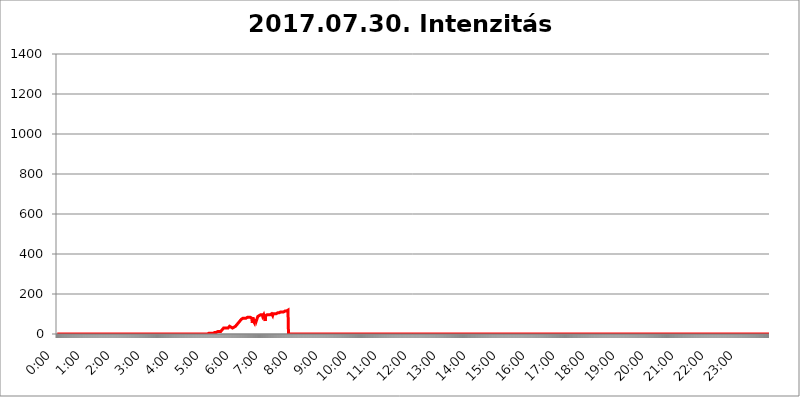
| Category | 2017.07.30. Intenzitás [W/m^2] |
|---|---|
| 0.0 | 0 |
| 0.0006944444444444445 | 0 |
| 0.001388888888888889 | 0 |
| 0.0020833333333333333 | 0 |
| 0.002777777777777778 | 0 |
| 0.003472222222222222 | 0 |
| 0.004166666666666667 | 0 |
| 0.004861111111111111 | 0 |
| 0.005555555555555556 | 0 |
| 0.0062499999999999995 | 0 |
| 0.006944444444444444 | 0 |
| 0.007638888888888889 | 0 |
| 0.008333333333333333 | 0 |
| 0.009027777777777779 | 0 |
| 0.009722222222222222 | 0 |
| 0.010416666666666666 | 0 |
| 0.011111111111111112 | 0 |
| 0.011805555555555555 | 0 |
| 0.012499999999999999 | 0 |
| 0.013194444444444444 | 0 |
| 0.013888888888888888 | 0 |
| 0.014583333333333332 | 0 |
| 0.015277777777777777 | 0 |
| 0.015972222222222224 | 0 |
| 0.016666666666666666 | 0 |
| 0.017361111111111112 | 0 |
| 0.018055555555555557 | 0 |
| 0.01875 | 0 |
| 0.019444444444444445 | 0 |
| 0.02013888888888889 | 0 |
| 0.020833333333333332 | 0 |
| 0.02152777777777778 | 0 |
| 0.022222222222222223 | 0 |
| 0.02291666666666667 | 0 |
| 0.02361111111111111 | 0 |
| 0.024305555555555556 | 0 |
| 0.024999999999999998 | 0 |
| 0.025694444444444447 | 0 |
| 0.02638888888888889 | 0 |
| 0.027083333333333334 | 0 |
| 0.027777777777777776 | 0 |
| 0.02847222222222222 | 0 |
| 0.029166666666666664 | 0 |
| 0.029861111111111113 | 0 |
| 0.030555555555555555 | 0 |
| 0.03125 | 0 |
| 0.03194444444444445 | 0 |
| 0.03263888888888889 | 0 |
| 0.03333333333333333 | 0 |
| 0.034027777777777775 | 0 |
| 0.034722222222222224 | 0 |
| 0.035416666666666666 | 0 |
| 0.036111111111111115 | 0 |
| 0.03680555555555556 | 0 |
| 0.0375 | 0 |
| 0.03819444444444444 | 0 |
| 0.03888888888888889 | 0 |
| 0.03958333333333333 | 0 |
| 0.04027777777777778 | 0 |
| 0.04097222222222222 | 0 |
| 0.041666666666666664 | 0 |
| 0.042361111111111106 | 0 |
| 0.04305555555555556 | 0 |
| 0.043750000000000004 | 0 |
| 0.044444444444444446 | 0 |
| 0.04513888888888889 | 0 |
| 0.04583333333333334 | 0 |
| 0.04652777777777778 | 0 |
| 0.04722222222222222 | 0 |
| 0.04791666666666666 | 0 |
| 0.04861111111111111 | 0 |
| 0.049305555555555554 | 0 |
| 0.049999999999999996 | 0 |
| 0.05069444444444445 | 0 |
| 0.051388888888888894 | 0 |
| 0.052083333333333336 | 0 |
| 0.05277777777777778 | 0 |
| 0.05347222222222222 | 0 |
| 0.05416666666666667 | 0 |
| 0.05486111111111111 | 0 |
| 0.05555555555555555 | 0 |
| 0.05625 | 0 |
| 0.05694444444444444 | 0 |
| 0.057638888888888885 | 0 |
| 0.05833333333333333 | 0 |
| 0.05902777777777778 | 0 |
| 0.059722222222222225 | 0 |
| 0.06041666666666667 | 0 |
| 0.061111111111111116 | 0 |
| 0.06180555555555556 | 0 |
| 0.0625 | 0 |
| 0.06319444444444444 | 0 |
| 0.06388888888888888 | 0 |
| 0.06458333333333334 | 0 |
| 0.06527777777777778 | 0 |
| 0.06597222222222222 | 0 |
| 0.06666666666666667 | 0 |
| 0.06736111111111111 | 0 |
| 0.06805555555555555 | 0 |
| 0.06874999999999999 | 0 |
| 0.06944444444444443 | 0 |
| 0.07013888888888889 | 0 |
| 0.07083333333333333 | 0 |
| 0.07152777777777779 | 0 |
| 0.07222222222222223 | 0 |
| 0.07291666666666667 | 0 |
| 0.07361111111111111 | 0 |
| 0.07430555555555556 | 0 |
| 0.075 | 0 |
| 0.07569444444444444 | 0 |
| 0.0763888888888889 | 0 |
| 0.07708333333333334 | 0 |
| 0.07777777777777778 | 0 |
| 0.07847222222222222 | 0 |
| 0.07916666666666666 | 0 |
| 0.0798611111111111 | 0 |
| 0.08055555555555556 | 0 |
| 0.08125 | 0 |
| 0.08194444444444444 | 0 |
| 0.08263888888888889 | 0 |
| 0.08333333333333333 | 0 |
| 0.08402777777777777 | 0 |
| 0.08472222222222221 | 0 |
| 0.08541666666666665 | 0 |
| 0.08611111111111112 | 0 |
| 0.08680555555555557 | 0 |
| 0.08750000000000001 | 0 |
| 0.08819444444444445 | 0 |
| 0.08888888888888889 | 0 |
| 0.08958333333333333 | 0 |
| 0.09027777777777778 | 0 |
| 0.09097222222222222 | 0 |
| 0.09166666666666667 | 0 |
| 0.09236111111111112 | 0 |
| 0.09305555555555556 | 0 |
| 0.09375 | 0 |
| 0.09444444444444444 | 0 |
| 0.09513888888888888 | 0 |
| 0.09583333333333333 | 0 |
| 0.09652777777777777 | 0 |
| 0.09722222222222222 | 0 |
| 0.09791666666666667 | 0 |
| 0.09861111111111111 | 0 |
| 0.09930555555555555 | 0 |
| 0.09999999999999999 | 0 |
| 0.10069444444444443 | 0 |
| 0.1013888888888889 | 0 |
| 0.10208333333333335 | 0 |
| 0.10277777777777779 | 0 |
| 0.10347222222222223 | 0 |
| 0.10416666666666667 | 0 |
| 0.10486111111111111 | 0 |
| 0.10555555555555556 | 0 |
| 0.10625 | 0 |
| 0.10694444444444444 | 0 |
| 0.1076388888888889 | 0 |
| 0.10833333333333334 | 0 |
| 0.10902777777777778 | 0 |
| 0.10972222222222222 | 0 |
| 0.1111111111111111 | 0 |
| 0.11180555555555556 | 0 |
| 0.11180555555555556 | 0 |
| 0.1125 | 0 |
| 0.11319444444444444 | 0 |
| 0.11388888888888889 | 0 |
| 0.11458333333333333 | 0 |
| 0.11527777777777777 | 0 |
| 0.11597222222222221 | 0 |
| 0.11666666666666665 | 0 |
| 0.1173611111111111 | 0 |
| 0.11805555555555557 | 0 |
| 0.11944444444444445 | 0 |
| 0.12013888888888889 | 0 |
| 0.12083333333333333 | 0 |
| 0.12152777777777778 | 0 |
| 0.12222222222222223 | 0 |
| 0.12291666666666667 | 0 |
| 0.12291666666666667 | 0 |
| 0.12361111111111112 | 0 |
| 0.12430555555555556 | 0 |
| 0.125 | 0 |
| 0.12569444444444444 | 0 |
| 0.12638888888888888 | 0 |
| 0.12708333333333333 | 0 |
| 0.16875 | 0 |
| 0.12847222222222224 | 0 |
| 0.12916666666666668 | 0 |
| 0.12986111111111112 | 0 |
| 0.13055555555555556 | 0 |
| 0.13125 | 0 |
| 0.13194444444444445 | 0 |
| 0.1326388888888889 | 0 |
| 0.13333333333333333 | 0 |
| 0.13402777777777777 | 0 |
| 0.13402777777777777 | 0 |
| 0.13472222222222222 | 0 |
| 0.13541666666666666 | 0 |
| 0.1361111111111111 | 0 |
| 0.13749999999999998 | 0 |
| 0.13819444444444443 | 0 |
| 0.1388888888888889 | 0 |
| 0.13958333333333334 | 0 |
| 0.14027777777777778 | 0 |
| 0.14097222222222222 | 0 |
| 0.14166666666666666 | 0 |
| 0.1423611111111111 | 0 |
| 0.14305555555555557 | 0 |
| 0.14375000000000002 | 0 |
| 0.14444444444444446 | 0 |
| 0.1451388888888889 | 0 |
| 0.1451388888888889 | 0 |
| 0.14652777777777778 | 0 |
| 0.14722222222222223 | 0 |
| 0.14791666666666667 | 0 |
| 0.1486111111111111 | 0 |
| 0.14930555555555555 | 0 |
| 0.15 | 0 |
| 0.15069444444444444 | 0 |
| 0.15138888888888888 | 0 |
| 0.15208333333333332 | 0 |
| 0.15277777777777776 | 0 |
| 0.15347222222222223 | 0 |
| 0.15416666666666667 | 0 |
| 0.15486111111111112 | 0 |
| 0.15555555555555556 | 0 |
| 0.15625 | 0 |
| 0.15694444444444444 | 0 |
| 0.15763888888888888 | 0 |
| 0.15833333333333333 | 0 |
| 0.15902777777777777 | 0 |
| 0.15972222222222224 | 0 |
| 0.16041666666666668 | 0 |
| 0.16111111111111112 | 0 |
| 0.16180555555555556 | 0 |
| 0.1625 | 0 |
| 0.16319444444444445 | 0 |
| 0.1638888888888889 | 0 |
| 0.16458333333333333 | 0 |
| 0.16527777777777777 | 0 |
| 0.16597222222222222 | 0 |
| 0.16666666666666666 | 0 |
| 0.1673611111111111 | 0 |
| 0.16805555555555554 | 0 |
| 0.16874999999999998 | 0 |
| 0.16944444444444443 | 0 |
| 0.17013888888888887 | 0 |
| 0.1708333333333333 | 0 |
| 0.17152777777777775 | 0 |
| 0.17222222222222225 | 0 |
| 0.1729166666666667 | 0 |
| 0.17361111111111113 | 0 |
| 0.17430555555555557 | 0 |
| 0.17500000000000002 | 0 |
| 0.17569444444444446 | 0 |
| 0.1763888888888889 | 0 |
| 0.17708333333333334 | 0 |
| 0.17777777777777778 | 0 |
| 0.17847222222222223 | 0 |
| 0.17916666666666667 | 0 |
| 0.1798611111111111 | 0 |
| 0.18055555555555555 | 0 |
| 0.18125 | 0 |
| 0.18194444444444444 | 0 |
| 0.1826388888888889 | 0 |
| 0.18333333333333335 | 0 |
| 0.1840277777777778 | 0 |
| 0.18472222222222223 | 0 |
| 0.18541666666666667 | 0 |
| 0.18611111111111112 | 0 |
| 0.18680555555555556 | 0 |
| 0.1875 | 0 |
| 0.18819444444444444 | 0 |
| 0.18888888888888888 | 0 |
| 0.18958333333333333 | 0 |
| 0.19027777777777777 | 0 |
| 0.1909722222222222 | 0 |
| 0.19166666666666665 | 0 |
| 0.19236111111111112 | 0 |
| 0.19305555555555554 | 0 |
| 0.19375 | 0 |
| 0.19444444444444445 | 0 |
| 0.1951388888888889 | 0 |
| 0.19583333333333333 | 0 |
| 0.19652777777777777 | 0 |
| 0.19722222222222222 | 0 |
| 0.19791666666666666 | 0 |
| 0.1986111111111111 | 0 |
| 0.19930555555555554 | 0 |
| 0.19999999999999998 | 0 |
| 0.20069444444444443 | 0 |
| 0.20138888888888887 | 0 |
| 0.2020833333333333 | 0 |
| 0.2027777777777778 | 0 |
| 0.2034722222222222 | 0 |
| 0.2041666666666667 | 0 |
| 0.20486111111111113 | 0 |
| 0.20555555555555557 | 0 |
| 0.20625000000000002 | 0 |
| 0.20694444444444446 | 0 |
| 0.2076388888888889 | 0 |
| 0.20833333333333334 | 0 |
| 0.20902777777777778 | 0 |
| 0.20972222222222223 | 0 |
| 0.21041666666666667 | 0 |
| 0.2111111111111111 | 0 |
| 0.21180555555555555 | 0 |
| 0.2125 | 3.525 |
| 0.21319444444444444 | 3.525 |
| 0.2138888888888889 | 3.525 |
| 0.21458333333333335 | 3.525 |
| 0.2152777777777778 | 3.525 |
| 0.21597222222222223 | 3.525 |
| 0.21666666666666667 | 3.525 |
| 0.21736111111111112 | 3.525 |
| 0.21805555555555556 | 3.525 |
| 0.21875 | 3.525 |
| 0.21944444444444444 | 7.887 |
| 0.22013888888888888 | 7.887 |
| 0.22083333333333333 | 7.887 |
| 0.22152777777777777 | 7.887 |
| 0.2222222222222222 | 7.887 |
| 0.22291666666666665 | 7.887 |
| 0.2236111111111111 | 7.887 |
| 0.22430555555555556 | 7.887 |
| 0.225 | 12.257 |
| 0.22569444444444445 | 12.257 |
| 0.2263888888888889 | 12.257 |
| 0.22708333333333333 | 12.257 |
| 0.22777777777777777 | 12.257 |
| 0.22847222222222222 | 12.257 |
| 0.22916666666666666 | 12.257 |
| 0.2298611111111111 | 12.257 |
| 0.23055555555555554 | 16.636 |
| 0.23124999999999998 | 21.024 |
| 0.23194444444444443 | 21.024 |
| 0.23263888888888887 | 25.419 |
| 0.2333333333333333 | 29.823 |
| 0.2340277777777778 | 29.823 |
| 0.2347222222222222 | 29.823 |
| 0.2354166666666667 | 29.823 |
| 0.23611111111111113 | 29.823 |
| 0.23680555555555557 | 29.823 |
| 0.23750000000000002 | 29.823 |
| 0.23819444444444446 | 29.823 |
| 0.2388888888888889 | 29.823 |
| 0.23958333333333334 | 29.823 |
| 0.24027777777777778 | 34.234 |
| 0.24097222222222223 | 34.234 |
| 0.24166666666666667 | 38.653 |
| 0.2423611111111111 | 38.653 |
| 0.24305555555555555 | 38.653 |
| 0.24375 | 34.234 |
| 0.24444444444444446 | 29.823 |
| 0.24513888888888888 | 29.823 |
| 0.24583333333333335 | 29.823 |
| 0.2465277777777778 | 29.823 |
| 0.24722222222222223 | 29.823 |
| 0.24791666666666667 | 34.234 |
| 0.24861111111111112 | 38.653 |
| 0.24930555555555556 | 34.234 |
| 0.25 | 38.653 |
| 0.25069444444444444 | 38.653 |
| 0.2513888888888889 | 43.079 |
| 0.2520833333333333 | 47.511 |
| 0.25277777777777777 | 47.511 |
| 0.2534722222222222 | 51.951 |
| 0.25416666666666665 | 56.398 |
| 0.2548611111111111 | 51.951 |
| 0.2555555555555556 | 60.85 |
| 0.25625000000000003 | 65.31 |
| 0.2569444444444445 | 60.85 |
| 0.2576388888888889 | 65.31 |
| 0.25833333333333336 | 74.246 |
| 0.2590277777777778 | 69.775 |
| 0.25972222222222224 | 78.722 |
| 0.2604166666666667 | 78.722 |
| 0.2611111111111111 | 78.722 |
| 0.26180555555555557 | 78.722 |
| 0.2625 | 78.722 |
| 0.26319444444444445 | 78.722 |
| 0.2638888888888889 | 78.722 |
| 0.26458333333333334 | 78.722 |
| 0.2652777777777778 | 78.722 |
| 0.2659722222222222 | 83.205 |
| 0.26666666666666666 | 83.205 |
| 0.2673611111111111 | 83.205 |
| 0.26805555555555555 | 83.205 |
| 0.26875 | 83.205 |
| 0.26944444444444443 | 83.205 |
| 0.2701388888888889 | 83.205 |
| 0.2708333333333333 | 83.205 |
| 0.27152777777777776 | 83.205 |
| 0.2722222222222222 | 78.722 |
| 0.27291666666666664 | 78.722 |
| 0.2736111111111111 | 56.398 |
| 0.2743055555555555 | 83.205 |
| 0.27499999999999997 | 65.31 |
| 0.27569444444444446 | 60.85 |
| 0.27638888888888885 | 56.398 |
| 0.27708333333333335 | 74.246 |
| 0.2777777777777778 | 56.398 |
| 0.27847222222222223 | 74.246 |
| 0.2791666666666667 | 65.31 |
| 0.2798611111111111 | 65.31 |
| 0.28055555555555556 | 65.31 |
| 0.28125 | 87.692 |
| 0.28194444444444444 | 87.692 |
| 0.2826388888888889 | 92.184 |
| 0.2833333333333333 | 92.184 |
| 0.28402777777777777 | 87.692 |
| 0.2847222222222222 | 92.184 |
| 0.28541666666666665 | 96.682 |
| 0.28611111111111115 | 96.682 |
| 0.28680555555555554 | 96.682 |
| 0.28750000000000003 | 96.682 |
| 0.2881944444444445 | 87.692 |
| 0.2888888888888889 | 92.184 |
| 0.28958333333333336 | 96.682 |
| 0.2902777777777778 | 96.682 |
| 0.29097222222222224 | 78.722 |
| 0.2916666666666667 | 65.31 |
| 0.2923611111111111 | 92.184 |
| 0.29305555555555557 | 87.692 |
| 0.29375 | 96.682 |
| 0.29444444444444445 | 96.682 |
| 0.2951388888888889 | 96.682 |
| 0.29583333333333334 | 96.682 |
| 0.2965277777777778 | 96.682 |
| 0.2972222222222222 | 96.682 |
| 0.29791666666666666 | 96.682 |
| 0.2986111111111111 | 96.682 |
| 0.29930555555555555 | 96.682 |
| 0.3 | 96.682 |
| 0.30069444444444443 | 101.184 |
| 0.3013888888888889 | 101.184 |
| 0.3020833333333333 | 92.184 |
| 0.30277777777777776 | 101.184 |
| 0.3034722222222222 | 101.184 |
| 0.30416666666666664 | 101.184 |
| 0.3048611111111111 | 101.184 |
| 0.3055555555555555 | 101.184 |
| 0.30624999999999997 | 101.184 |
| 0.3069444444444444 | 101.184 |
| 0.3076388888888889 | 101.184 |
| 0.30833333333333335 | 105.69 |
| 0.3090277777777778 | 105.69 |
| 0.30972222222222223 | 105.69 |
| 0.3104166666666667 | 105.69 |
| 0.3111111111111111 | 105.69 |
| 0.31180555555555556 | 110.201 |
| 0.3125 | 110.201 |
| 0.31319444444444444 | 110.201 |
| 0.3138888888888889 | 110.201 |
| 0.3145833333333333 | 110.201 |
| 0.31527777777777777 | 110.201 |
| 0.3159722222222222 | 110.201 |
| 0.31666666666666665 | 110.201 |
| 0.31736111111111115 | 110.201 |
| 0.31805555555555554 | 110.201 |
| 0.31875000000000003 | 114.716 |
| 0.3194444444444445 | 114.716 |
| 0.3201388888888889 | 114.716 |
| 0.32083333333333336 | 114.716 |
| 0.3215277777777778 | 114.716 |
| 0.32222222222222224 | 119.235 |
| 0.3229166666666667 | 119.235 |
| 0.3236111111111111 | 119.235 |
| 0.32430555555555557 | 0 |
| 0.325 | 0 |
| 0.32569444444444445 | 0 |
| 0.3263888888888889 | 0 |
| 0.32708333333333334 | 0 |
| 0.3277777777777778 | 0 |
| 0.3284722222222222 | 0 |
| 0.32916666666666666 | 0 |
| 0.3298611111111111 | 0 |
| 0.33055555555555555 | 0 |
| 0.33125 | 0 |
| 0.33194444444444443 | 0 |
| 0.3326388888888889 | 0 |
| 0.3333333333333333 | 0 |
| 0.3340277777777778 | 0 |
| 0.3347222222222222 | 0 |
| 0.3354166666666667 | 0 |
| 0.3361111111111111 | 0 |
| 0.3368055555555556 | 0 |
| 0.33749999999999997 | 0 |
| 0.33819444444444446 | 0 |
| 0.33888888888888885 | 0 |
| 0.33958333333333335 | 0 |
| 0.34027777777777773 | 0 |
| 0.34097222222222223 | 0 |
| 0.3416666666666666 | 0 |
| 0.3423611111111111 | 0 |
| 0.3430555555555555 | 0 |
| 0.34375 | 0 |
| 0.3444444444444445 | 0 |
| 0.3451388888888889 | 0 |
| 0.3458333333333334 | 0 |
| 0.34652777777777777 | 0 |
| 0.34722222222222227 | 0 |
| 0.34791666666666665 | 0 |
| 0.34861111111111115 | 0 |
| 0.34930555555555554 | 0 |
| 0.35000000000000003 | 0 |
| 0.3506944444444444 | 0 |
| 0.3513888888888889 | 0 |
| 0.3520833333333333 | 0 |
| 0.3527777777777778 | 0 |
| 0.3534722222222222 | 0 |
| 0.3541666666666667 | 0 |
| 0.3548611111111111 | 0 |
| 0.35555555555555557 | 0 |
| 0.35625 | 0 |
| 0.35694444444444445 | 0 |
| 0.3576388888888889 | 0 |
| 0.35833333333333334 | 0 |
| 0.3590277777777778 | 0 |
| 0.3597222222222222 | 0 |
| 0.36041666666666666 | 0 |
| 0.3611111111111111 | 0 |
| 0.36180555555555555 | 0 |
| 0.3625 | 0 |
| 0.36319444444444443 | 0 |
| 0.3638888888888889 | 0 |
| 0.3645833333333333 | 0 |
| 0.3652777777777778 | 0 |
| 0.3659722222222222 | 0 |
| 0.3666666666666667 | 0 |
| 0.3673611111111111 | 0 |
| 0.3680555555555556 | 0 |
| 0.36874999999999997 | 0 |
| 0.36944444444444446 | 0 |
| 0.37013888888888885 | 0 |
| 0.37083333333333335 | 0 |
| 0.37152777777777773 | 0 |
| 0.37222222222222223 | 0 |
| 0.3729166666666666 | 0 |
| 0.3736111111111111 | 0 |
| 0.3743055555555555 | 0 |
| 0.375 | 0 |
| 0.3756944444444445 | 0 |
| 0.3763888888888889 | 0 |
| 0.3770833333333334 | 0 |
| 0.37777777777777777 | 0 |
| 0.37847222222222227 | 0 |
| 0.37916666666666665 | 0 |
| 0.37986111111111115 | 0 |
| 0.38055555555555554 | 0 |
| 0.38125000000000003 | 0 |
| 0.3819444444444444 | 0 |
| 0.3826388888888889 | 0 |
| 0.3833333333333333 | 0 |
| 0.3840277777777778 | 0 |
| 0.3847222222222222 | 0 |
| 0.3854166666666667 | 0 |
| 0.3861111111111111 | 0 |
| 0.38680555555555557 | 0 |
| 0.3875 | 0 |
| 0.38819444444444445 | 0 |
| 0.3888888888888889 | 0 |
| 0.38958333333333334 | 0 |
| 0.3902777777777778 | 0 |
| 0.3909722222222222 | 0 |
| 0.39166666666666666 | 0 |
| 0.3923611111111111 | 0 |
| 0.39305555555555555 | 0 |
| 0.39375 | 0 |
| 0.39444444444444443 | 0 |
| 0.3951388888888889 | 0 |
| 0.3958333333333333 | 0 |
| 0.3965277777777778 | 0 |
| 0.3972222222222222 | 0 |
| 0.3979166666666667 | 0 |
| 0.3986111111111111 | 0 |
| 0.3993055555555556 | 0 |
| 0.39999999999999997 | 0 |
| 0.40069444444444446 | 0 |
| 0.40138888888888885 | 0 |
| 0.40208333333333335 | 0 |
| 0.40277777777777773 | 0 |
| 0.40347222222222223 | 0 |
| 0.4041666666666666 | 0 |
| 0.4048611111111111 | 0 |
| 0.4055555555555555 | 0 |
| 0.40625 | 0 |
| 0.4069444444444445 | 0 |
| 0.4076388888888889 | 0 |
| 0.4083333333333334 | 0 |
| 0.40902777777777777 | 0 |
| 0.40972222222222227 | 0 |
| 0.41041666666666665 | 0 |
| 0.41111111111111115 | 0 |
| 0.41180555555555554 | 0 |
| 0.41250000000000003 | 0 |
| 0.4131944444444444 | 0 |
| 0.4138888888888889 | 0 |
| 0.4145833333333333 | 0 |
| 0.4152777777777778 | 0 |
| 0.4159722222222222 | 0 |
| 0.4166666666666667 | 0 |
| 0.4173611111111111 | 0 |
| 0.41805555555555557 | 0 |
| 0.41875 | 0 |
| 0.41944444444444445 | 0 |
| 0.4201388888888889 | 0 |
| 0.42083333333333334 | 0 |
| 0.4215277777777778 | 0 |
| 0.4222222222222222 | 0 |
| 0.42291666666666666 | 0 |
| 0.4236111111111111 | 0 |
| 0.42430555555555555 | 0 |
| 0.425 | 0 |
| 0.42569444444444443 | 0 |
| 0.4263888888888889 | 0 |
| 0.4270833333333333 | 0 |
| 0.4277777777777778 | 0 |
| 0.4284722222222222 | 0 |
| 0.4291666666666667 | 0 |
| 0.4298611111111111 | 0 |
| 0.4305555555555556 | 0 |
| 0.43124999999999997 | 0 |
| 0.43194444444444446 | 0 |
| 0.43263888888888885 | 0 |
| 0.43333333333333335 | 0 |
| 0.43402777777777773 | 0 |
| 0.43472222222222223 | 0 |
| 0.4354166666666666 | 0 |
| 0.4361111111111111 | 0 |
| 0.4368055555555555 | 0 |
| 0.4375 | 0 |
| 0.4381944444444445 | 0 |
| 0.4388888888888889 | 0 |
| 0.4395833333333334 | 0 |
| 0.44027777777777777 | 0 |
| 0.44097222222222227 | 0 |
| 0.44166666666666665 | 0 |
| 0.44236111111111115 | 0 |
| 0.44305555555555554 | 0 |
| 0.44375000000000003 | 0 |
| 0.4444444444444444 | 0 |
| 0.4451388888888889 | 0 |
| 0.4458333333333333 | 0 |
| 0.4465277777777778 | 0 |
| 0.4472222222222222 | 0 |
| 0.4479166666666667 | 0 |
| 0.4486111111111111 | 0 |
| 0.44930555555555557 | 0 |
| 0.45 | 0 |
| 0.45069444444444445 | 0 |
| 0.4513888888888889 | 0 |
| 0.45208333333333334 | 0 |
| 0.4527777777777778 | 0 |
| 0.4534722222222222 | 0 |
| 0.45416666666666666 | 0 |
| 0.4548611111111111 | 0 |
| 0.45555555555555555 | 0 |
| 0.45625 | 0 |
| 0.45694444444444443 | 0 |
| 0.4576388888888889 | 0 |
| 0.4583333333333333 | 0 |
| 0.4590277777777778 | 0 |
| 0.4597222222222222 | 0 |
| 0.4604166666666667 | 0 |
| 0.4611111111111111 | 0 |
| 0.4618055555555556 | 0 |
| 0.46249999999999997 | 0 |
| 0.46319444444444446 | 0 |
| 0.46388888888888885 | 0 |
| 0.46458333333333335 | 0 |
| 0.46527777777777773 | 0 |
| 0.46597222222222223 | 0 |
| 0.4666666666666666 | 0 |
| 0.4673611111111111 | 0 |
| 0.4680555555555555 | 0 |
| 0.46875 | 0 |
| 0.4694444444444445 | 0 |
| 0.4701388888888889 | 0 |
| 0.4708333333333334 | 0 |
| 0.47152777777777777 | 0 |
| 0.47222222222222227 | 0 |
| 0.47291666666666665 | 0 |
| 0.47361111111111115 | 0 |
| 0.47430555555555554 | 0 |
| 0.47500000000000003 | 0 |
| 0.4756944444444444 | 0 |
| 0.4763888888888889 | 0 |
| 0.4770833333333333 | 0 |
| 0.4777777777777778 | 0 |
| 0.4784722222222222 | 0 |
| 0.4791666666666667 | 0 |
| 0.4798611111111111 | 0 |
| 0.48055555555555557 | 0 |
| 0.48125 | 0 |
| 0.48194444444444445 | 0 |
| 0.4826388888888889 | 0 |
| 0.48333333333333334 | 0 |
| 0.4840277777777778 | 0 |
| 0.4847222222222222 | 0 |
| 0.48541666666666666 | 0 |
| 0.4861111111111111 | 0 |
| 0.48680555555555555 | 0 |
| 0.4875 | 0 |
| 0.48819444444444443 | 0 |
| 0.4888888888888889 | 0 |
| 0.4895833333333333 | 0 |
| 0.4902777777777778 | 0 |
| 0.4909722222222222 | 0 |
| 0.4916666666666667 | 0 |
| 0.4923611111111111 | 0 |
| 0.4930555555555556 | 0 |
| 0.49374999999999997 | 0 |
| 0.49444444444444446 | 0 |
| 0.49513888888888885 | 0 |
| 0.49583333333333335 | 0 |
| 0.49652777777777773 | 0 |
| 0.49722222222222223 | 0 |
| 0.4979166666666666 | 0 |
| 0.4986111111111111 | 0 |
| 0.4993055555555555 | 0 |
| 0.5 | 0 |
| 0.5006944444444444 | 0 |
| 0.5013888888888889 | 0 |
| 0.5020833333333333 | 0 |
| 0.5027777777777778 | 0 |
| 0.5034722222222222 | 0 |
| 0.5041666666666667 | 0 |
| 0.5048611111111111 | 0 |
| 0.5055555555555555 | 0 |
| 0.50625 | 0 |
| 0.5069444444444444 | 0 |
| 0.5076388888888889 | 0 |
| 0.5083333333333333 | 0 |
| 0.5090277777777777 | 0 |
| 0.5097222222222222 | 0 |
| 0.5104166666666666 | 0 |
| 0.5111111111111112 | 0 |
| 0.5118055555555555 | 0 |
| 0.5125000000000001 | 0 |
| 0.5131944444444444 | 0 |
| 0.513888888888889 | 0 |
| 0.5145833333333333 | 0 |
| 0.5152777777777778 | 0 |
| 0.5159722222222222 | 0 |
| 0.5166666666666667 | 0 |
| 0.517361111111111 | 0 |
| 0.5180555555555556 | 0 |
| 0.5187499999999999 | 0 |
| 0.5194444444444445 | 0 |
| 0.5201388888888888 | 0 |
| 0.5208333333333334 | 0 |
| 0.5215277777777778 | 0 |
| 0.5222222222222223 | 0 |
| 0.5229166666666667 | 0 |
| 0.5236111111111111 | 0 |
| 0.5243055555555556 | 0 |
| 0.525 | 0 |
| 0.5256944444444445 | 0 |
| 0.5263888888888889 | 0 |
| 0.5270833333333333 | 0 |
| 0.5277777777777778 | 0 |
| 0.5284722222222222 | 0 |
| 0.5291666666666667 | 0 |
| 0.5298611111111111 | 0 |
| 0.5305555555555556 | 0 |
| 0.53125 | 0 |
| 0.5319444444444444 | 0 |
| 0.5326388888888889 | 0 |
| 0.5333333333333333 | 0 |
| 0.5340277777777778 | 0 |
| 0.5347222222222222 | 0 |
| 0.5354166666666667 | 0 |
| 0.5361111111111111 | 0 |
| 0.5368055555555555 | 0 |
| 0.5375 | 0 |
| 0.5381944444444444 | 0 |
| 0.5388888888888889 | 0 |
| 0.5395833333333333 | 0 |
| 0.5402777777777777 | 0 |
| 0.5409722222222222 | 0 |
| 0.5416666666666666 | 0 |
| 0.5423611111111112 | 0 |
| 0.5430555555555555 | 0 |
| 0.5437500000000001 | 0 |
| 0.5444444444444444 | 0 |
| 0.545138888888889 | 0 |
| 0.5458333333333333 | 0 |
| 0.5465277777777778 | 0 |
| 0.5472222222222222 | 0 |
| 0.5479166666666667 | 0 |
| 0.548611111111111 | 0 |
| 0.5493055555555556 | 0 |
| 0.5499999999999999 | 0 |
| 0.5506944444444445 | 0 |
| 0.5513888888888888 | 0 |
| 0.5520833333333334 | 0 |
| 0.5527777777777778 | 0 |
| 0.5534722222222223 | 0 |
| 0.5541666666666667 | 0 |
| 0.5548611111111111 | 0 |
| 0.5555555555555556 | 0 |
| 0.55625 | 0 |
| 0.5569444444444445 | 0 |
| 0.5576388888888889 | 0 |
| 0.5583333333333333 | 0 |
| 0.5590277777777778 | 0 |
| 0.5597222222222222 | 0 |
| 0.5604166666666667 | 0 |
| 0.5611111111111111 | 0 |
| 0.5618055555555556 | 0 |
| 0.5625 | 0 |
| 0.5631944444444444 | 0 |
| 0.5638888888888889 | 0 |
| 0.5645833333333333 | 0 |
| 0.5652777777777778 | 0 |
| 0.5659722222222222 | 0 |
| 0.5666666666666667 | 0 |
| 0.5673611111111111 | 0 |
| 0.5680555555555555 | 0 |
| 0.56875 | 0 |
| 0.5694444444444444 | 0 |
| 0.5701388888888889 | 0 |
| 0.5708333333333333 | 0 |
| 0.5715277777777777 | 0 |
| 0.5722222222222222 | 0 |
| 0.5729166666666666 | 0 |
| 0.5736111111111112 | 0 |
| 0.5743055555555555 | 0 |
| 0.5750000000000001 | 0 |
| 0.5756944444444444 | 0 |
| 0.576388888888889 | 0 |
| 0.5770833333333333 | 0 |
| 0.5777777777777778 | 0 |
| 0.5784722222222222 | 0 |
| 0.5791666666666667 | 0 |
| 0.579861111111111 | 0 |
| 0.5805555555555556 | 0 |
| 0.5812499999999999 | 0 |
| 0.5819444444444445 | 0 |
| 0.5826388888888888 | 0 |
| 0.5833333333333334 | 0 |
| 0.5840277777777778 | 0 |
| 0.5847222222222223 | 0 |
| 0.5854166666666667 | 0 |
| 0.5861111111111111 | 0 |
| 0.5868055555555556 | 0 |
| 0.5875 | 0 |
| 0.5881944444444445 | 0 |
| 0.5888888888888889 | 0 |
| 0.5895833333333333 | 0 |
| 0.5902777777777778 | 0 |
| 0.5909722222222222 | 0 |
| 0.5916666666666667 | 0 |
| 0.5923611111111111 | 0 |
| 0.5930555555555556 | 0 |
| 0.59375 | 0 |
| 0.5944444444444444 | 0 |
| 0.5951388888888889 | 0 |
| 0.5958333333333333 | 0 |
| 0.5965277777777778 | 0 |
| 0.5972222222222222 | 0 |
| 0.5979166666666667 | 0 |
| 0.5986111111111111 | 0 |
| 0.5993055555555555 | 0 |
| 0.6 | 0 |
| 0.6006944444444444 | 0 |
| 0.6013888888888889 | 0 |
| 0.6020833333333333 | 0 |
| 0.6027777777777777 | 0 |
| 0.6034722222222222 | 0 |
| 0.6041666666666666 | 0 |
| 0.6048611111111112 | 0 |
| 0.6055555555555555 | 0 |
| 0.6062500000000001 | 0 |
| 0.6069444444444444 | 0 |
| 0.607638888888889 | 0 |
| 0.6083333333333333 | 0 |
| 0.6090277777777778 | 0 |
| 0.6097222222222222 | 0 |
| 0.6104166666666667 | 0 |
| 0.611111111111111 | 0 |
| 0.6118055555555556 | 0 |
| 0.6124999999999999 | 0 |
| 0.6131944444444445 | 0 |
| 0.6138888888888888 | 0 |
| 0.6145833333333334 | 0 |
| 0.6152777777777778 | 0 |
| 0.6159722222222223 | 0 |
| 0.6166666666666667 | 0 |
| 0.6173611111111111 | 0 |
| 0.6180555555555556 | 0 |
| 0.61875 | 0 |
| 0.6194444444444445 | 0 |
| 0.6201388888888889 | 0 |
| 0.6208333333333333 | 0 |
| 0.6215277777777778 | 0 |
| 0.6222222222222222 | 0 |
| 0.6229166666666667 | 0 |
| 0.6236111111111111 | 0 |
| 0.6243055555555556 | 0 |
| 0.625 | 0 |
| 0.6256944444444444 | 0 |
| 0.6263888888888889 | 0 |
| 0.6270833333333333 | 0 |
| 0.6277777777777778 | 0 |
| 0.6284722222222222 | 0 |
| 0.6291666666666667 | 0 |
| 0.6298611111111111 | 0 |
| 0.6305555555555555 | 0 |
| 0.63125 | 0 |
| 0.6319444444444444 | 0 |
| 0.6326388888888889 | 0 |
| 0.6333333333333333 | 0 |
| 0.6340277777777777 | 0 |
| 0.6347222222222222 | 0 |
| 0.6354166666666666 | 0 |
| 0.6361111111111112 | 0 |
| 0.6368055555555555 | 0 |
| 0.6375000000000001 | 0 |
| 0.6381944444444444 | 0 |
| 0.638888888888889 | 0 |
| 0.6395833333333333 | 0 |
| 0.6402777777777778 | 0 |
| 0.6409722222222222 | 0 |
| 0.6416666666666667 | 0 |
| 0.642361111111111 | 0 |
| 0.6430555555555556 | 0 |
| 0.6437499999999999 | 0 |
| 0.6444444444444445 | 0 |
| 0.6451388888888888 | 0 |
| 0.6458333333333334 | 0 |
| 0.6465277777777778 | 0 |
| 0.6472222222222223 | 0 |
| 0.6479166666666667 | 0 |
| 0.6486111111111111 | 0 |
| 0.6493055555555556 | 0 |
| 0.65 | 0 |
| 0.6506944444444445 | 0 |
| 0.6513888888888889 | 0 |
| 0.6520833333333333 | 0 |
| 0.6527777777777778 | 0 |
| 0.6534722222222222 | 0 |
| 0.6541666666666667 | 0 |
| 0.6548611111111111 | 0 |
| 0.6555555555555556 | 0 |
| 0.65625 | 0 |
| 0.6569444444444444 | 0 |
| 0.6576388888888889 | 0 |
| 0.6583333333333333 | 0 |
| 0.6590277777777778 | 0 |
| 0.6597222222222222 | 0 |
| 0.6604166666666667 | 0 |
| 0.6611111111111111 | 0 |
| 0.6618055555555555 | 0 |
| 0.6625 | 0 |
| 0.6631944444444444 | 0 |
| 0.6638888888888889 | 0 |
| 0.6645833333333333 | 0 |
| 0.6652777777777777 | 0 |
| 0.6659722222222222 | 0 |
| 0.6666666666666666 | 0 |
| 0.6673611111111111 | 0 |
| 0.6680555555555556 | 0 |
| 0.6687500000000001 | 0 |
| 0.6694444444444444 | 0 |
| 0.6701388888888888 | 0 |
| 0.6708333333333334 | 0 |
| 0.6715277777777778 | 0 |
| 0.6722222222222222 | 0 |
| 0.6729166666666666 | 0 |
| 0.6736111111111112 | 0 |
| 0.6743055555555556 | 0 |
| 0.6749999999999999 | 0 |
| 0.6756944444444444 | 0 |
| 0.6763888888888889 | 0 |
| 0.6770833333333334 | 0 |
| 0.6777777777777777 | 0 |
| 0.6784722222222223 | 0 |
| 0.6791666666666667 | 0 |
| 0.6798611111111111 | 0 |
| 0.6805555555555555 | 0 |
| 0.68125 | 0 |
| 0.6819444444444445 | 0 |
| 0.6826388888888889 | 0 |
| 0.6833333333333332 | 0 |
| 0.6840277777777778 | 0 |
| 0.6847222222222222 | 0 |
| 0.6854166666666667 | 0 |
| 0.686111111111111 | 0 |
| 0.6868055555555556 | 0 |
| 0.6875 | 0 |
| 0.6881944444444444 | 0 |
| 0.688888888888889 | 0 |
| 0.6895833333333333 | 0 |
| 0.6902777777777778 | 0 |
| 0.6909722222222222 | 0 |
| 0.6916666666666668 | 0 |
| 0.6923611111111111 | 0 |
| 0.6930555555555555 | 0 |
| 0.69375 | 0 |
| 0.6944444444444445 | 0 |
| 0.6951388888888889 | 0 |
| 0.6958333333333333 | 0 |
| 0.6965277777777777 | 0 |
| 0.6972222222222223 | 0 |
| 0.6979166666666666 | 0 |
| 0.6986111111111111 | 0 |
| 0.6993055555555556 | 0 |
| 0.7000000000000001 | 0 |
| 0.7006944444444444 | 0 |
| 0.7013888888888888 | 0 |
| 0.7020833333333334 | 0 |
| 0.7027777777777778 | 0 |
| 0.7034722222222222 | 0 |
| 0.7041666666666666 | 0 |
| 0.7048611111111112 | 0 |
| 0.7055555555555556 | 0 |
| 0.7062499999999999 | 0 |
| 0.7069444444444444 | 0 |
| 0.7076388888888889 | 0 |
| 0.7083333333333334 | 0 |
| 0.7090277777777777 | 0 |
| 0.7097222222222223 | 0 |
| 0.7104166666666667 | 0 |
| 0.7111111111111111 | 0 |
| 0.7118055555555555 | 0 |
| 0.7125 | 0 |
| 0.7131944444444445 | 0 |
| 0.7138888888888889 | 0 |
| 0.7145833333333332 | 0 |
| 0.7152777777777778 | 0 |
| 0.7159722222222222 | 0 |
| 0.7166666666666667 | 0 |
| 0.717361111111111 | 0 |
| 0.7180555555555556 | 0 |
| 0.71875 | 0 |
| 0.7194444444444444 | 0 |
| 0.720138888888889 | 0 |
| 0.7208333333333333 | 0 |
| 0.7215277777777778 | 0 |
| 0.7222222222222222 | 0 |
| 0.7229166666666668 | 0 |
| 0.7236111111111111 | 0 |
| 0.7243055555555555 | 0 |
| 0.725 | 0 |
| 0.7256944444444445 | 0 |
| 0.7263888888888889 | 0 |
| 0.7270833333333333 | 0 |
| 0.7277777777777777 | 0 |
| 0.7284722222222223 | 0 |
| 0.7291666666666666 | 0 |
| 0.7298611111111111 | 0 |
| 0.7305555555555556 | 0 |
| 0.7312500000000001 | 0 |
| 0.7319444444444444 | 0 |
| 0.7326388888888888 | 0 |
| 0.7333333333333334 | 0 |
| 0.7340277777777778 | 0 |
| 0.7347222222222222 | 0 |
| 0.7354166666666666 | 0 |
| 0.7361111111111112 | 0 |
| 0.7368055555555556 | 0 |
| 0.7374999999999999 | 0 |
| 0.7381944444444444 | 0 |
| 0.7388888888888889 | 0 |
| 0.7395833333333334 | 0 |
| 0.7402777777777777 | 0 |
| 0.7409722222222223 | 0 |
| 0.7416666666666667 | 0 |
| 0.7423611111111111 | 0 |
| 0.7430555555555555 | 0 |
| 0.74375 | 0 |
| 0.7444444444444445 | 0 |
| 0.7451388888888889 | 0 |
| 0.7458333333333332 | 0 |
| 0.7465277777777778 | 0 |
| 0.7472222222222222 | 0 |
| 0.7479166666666667 | 0 |
| 0.748611111111111 | 0 |
| 0.7493055555555556 | 0 |
| 0.75 | 0 |
| 0.7506944444444444 | 0 |
| 0.751388888888889 | 0 |
| 0.7520833333333333 | 0 |
| 0.7527777777777778 | 0 |
| 0.7534722222222222 | 0 |
| 0.7541666666666668 | 0 |
| 0.7548611111111111 | 0 |
| 0.7555555555555555 | 0 |
| 0.75625 | 0 |
| 0.7569444444444445 | 0 |
| 0.7576388888888889 | 0 |
| 0.7583333333333333 | 0 |
| 0.7590277777777777 | 0 |
| 0.7597222222222223 | 0 |
| 0.7604166666666666 | 0 |
| 0.7611111111111111 | 0 |
| 0.7618055555555556 | 0 |
| 0.7625000000000001 | 0 |
| 0.7631944444444444 | 0 |
| 0.7638888888888888 | 0 |
| 0.7645833333333334 | 0 |
| 0.7652777777777778 | 0 |
| 0.7659722222222222 | 0 |
| 0.7666666666666666 | 0 |
| 0.7673611111111112 | 0 |
| 0.7680555555555556 | 0 |
| 0.7687499999999999 | 0 |
| 0.7694444444444444 | 0 |
| 0.7701388888888889 | 0 |
| 0.7708333333333334 | 0 |
| 0.7715277777777777 | 0 |
| 0.7722222222222223 | 0 |
| 0.7729166666666667 | 0 |
| 0.7736111111111111 | 0 |
| 0.7743055555555555 | 0 |
| 0.775 | 0 |
| 0.7756944444444445 | 0 |
| 0.7763888888888889 | 0 |
| 0.7770833333333332 | 0 |
| 0.7777777777777778 | 0 |
| 0.7784722222222222 | 0 |
| 0.7791666666666667 | 0 |
| 0.779861111111111 | 0 |
| 0.7805555555555556 | 0 |
| 0.78125 | 0 |
| 0.7819444444444444 | 0 |
| 0.782638888888889 | 0 |
| 0.7833333333333333 | 0 |
| 0.7840277777777778 | 0 |
| 0.7847222222222222 | 0 |
| 0.7854166666666668 | 0 |
| 0.7861111111111111 | 0 |
| 0.7868055555555555 | 0 |
| 0.7875 | 0 |
| 0.7881944444444445 | 0 |
| 0.7888888888888889 | 0 |
| 0.7895833333333333 | 0 |
| 0.7902777777777777 | 0 |
| 0.7909722222222223 | 0 |
| 0.7916666666666666 | 0 |
| 0.7923611111111111 | 0 |
| 0.7930555555555556 | 0 |
| 0.7937500000000001 | 0 |
| 0.7944444444444444 | 0 |
| 0.7951388888888888 | 0 |
| 0.7958333333333334 | 0 |
| 0.7965277777777778 | 0 |
| 0.7972222222222222 | 0 |
| 0.7979166666666666 | 0 |
| 0.7986111111111112 | 0 |
| 0.7993055555555556 | 0 |
| 0.7999999999999999 | 0 |
| 0.8006944444444444 | 0 |
| 0.8013888888888889 | 0 |
| 0.8020833333333334 | 0 |
| 0.8027777777777777 | 0 |
| 0.8034722222222223 | 0 |
| 0.8041666666666667 | 0 |
| 0.8048611111111111 | 0 |
| 0.8055555555555555 | 0 |
| 0.80625 | 0 |
| 0.8069444444444445 | 0 |
| 0.8076388888888889 | 0 |
| 0.8083333333333332 | 0 |
| 0.8090277777777778 | 0 |
| 0.8097222222222222 | 0 |
| 0.8104166666666667 | 0 |
| 0.811111111111111 | 0 |
| 0.8118055555555556 | 0 |
| 0.8125 | 0 |
| 0.8131944444444444 | 0 |
| 0.813888888888889 | 0 |
| 0.8145833333333333 | 0 |
| 0.8152777777777778 | 0 |
| 0.8159722222222222 | 0 |
| 0.8166666666666668 | 0 |
| 0.8173611111111111 | 0 |
| 0.8180555555555555 | 0 |
| 0.81875 | 0 |
| 0.8194444444444445 | 0 |
| 0.8201388888888889 | 0 |
| 0.8208333333333333 | 0 |
| 0.8215277777777777 | 0 |
| 0.8222222222222223 | 0 |
| 0.8229166666666666 | 0 |
| 0.8236111111111111 | 0 |
| 0.8243055555555556 | 0 |
| 0.8250000000000001 | 0 |
| 0.8256944444444444 | 0 |
| 0.8263888888888888 | 0 |
| 0.8270833333333334 | 0 |
| 0.8277777777777778 | 0 |
| 0.8284722222222222 | 0 |
| 0.8291666666666666 | 0 |
| 0.8298611111111112 | 0 |
| 0.8305555555555556 | 0 |
| 0.8312499999999999 | 0 |
| 0.8319444444444444 | 0 |
| 0.8326388888888889 | 0 |
| 0.8333333333333334 | 0 |
| 0.8340277777777777 | 0 |
| 0.8347222222222223 | 0 |
| 0.8354166666666667 | 0 |
| 0.8361111111111111 | 0 |
| 0.8368055555555555 | 0 |
| 0.8375 | 0 |
| 0.8381944444444445 | 0 |
| 0.8388888888888889 | 0 |
| 0.8395833333333332 | 0 |
| 0.8402777777777778 | 0 |
| 0.8409722222222222 | 0 |
| 0.8416666666666667 | 0 |
| 0.842361111111111 | 0 |
| 0.8430555555555556 | 0 |
| 0.84375 | 0 |
| 0.8444444444444444 | 0 |
| 0.845138888888889 | 0 |
| 0.8458333333333333 | 0 |
| 0.8465277777777778 | 0 |
| 0.8472222222222222 | 0 |
| 0.8479166666666668 | 0 |
| 0.8486111111111111 | 0 |
| 0.8493055555555555 | 0 |
| 0.85 | 0 |
| 0.8506944444444445 | 0 |
| 0.8513888888888889 | 0 |
| 0.8520833333333333 | 0 |
| 0.8527777777777777 | 0 |
| 0.8534722222222223 | 0 |
| 0.8541666666666666 | 0 |
| 0.8548611111111111 | 0 |
| 0.8555555555555556 | 0 |
| 0.8562500000000001 | 0 |
| 0.8569444444444444 | 0 |
| 0.8576388888888888 | 0 |
| 0.8583333333333334 | 0 |
| 0.8590277777777778 | 0 |
| 0.8597222222222222 | 0 |
| 0.8604166666666666 | 0 |
| 0.8611111111111112 | 0 |
| 0.8618055555555556 | 0 |
| 0.8624999999999999 | 0 |
| 0.8631944444444444 | 0 |
| 0.8638888888888889 | 0 |
| 0.8645833333333334 | 0 |
| 0.8652777777777777 | 0 |
| 0.8659722222222223 | 0 |
| 0.8666666666666667 | 0 |
| 0.8673611111111111 | 0 |
| 0.8680555555555555 | 0 |
| 0.86875 | 0 |
| 0.8694444444444445 | 0 |
| 0.8701388888888889 | 0 |
| 0.8708333333333332 | 0 |
| 0.8715277777777778 | 0 |
| 0.8722222222222222 | 0 |
| 0.8729166666666667 | 0 |
| 0.873611111111111 | 0 |
| 0.8743055555555556 | 0 |
| 0.875 | 0 |
| 0.8756944444444444 | 0 |
| 0.876388888888889 | 0 |
| 0.8770833333333333 | 0 |
| 0.8777777777777778 | 0 |
| 0.8784722222222222 | 0 |
| 0.8791666666666668 | 0 |
| 0.8798611111111111 | 0 |
| 0.8805555555555555 | 0 |
| 0.88125 | 0 |
| 0.8819444444444445 | 0 |
| 0.8826388888888889 | 0 |
| 0.8833333333333333 | 0 |
| 0.8840277777777777 | 0 |
| 0.8847222222222223 | 0 |
| 0.8854166666666666 | 0 |
| 0.8861111111111111 | 0 |
| 0.8868055555555556 | 0 |
| 0.8875000000000001 | 0 |
| 0.8881944444444444 | 0 |
| 0.8888888888888888 | 0 |
| 0.8895833333333334 | 0 |
| 0.8902777777777778 | 0 |
| 0.8909722222222222 | 0 |
| 0.8916666666666666 | 0 |
| 0.8923611111111112 | 0 |
| 0.8930555555555556 | 0 |
| 0.8937499999999999 | 0 |
| 0.8944444444444444 | 0 |
| 0.8951388888888889 | 0 |
| 0.8958333333333334 | 0 |
| 0.8965277777777777 | 0 |
| 0.8972222222222223 | 0 |
| 0.8979166666666667 | 0 |
| 0.8986111111111111 | 0 |
| 0.8993055555555555 | 0 |
| 0.9 | 0 |
| 0.9006944444444445 | 0 |
| 0.9013888888888889 | 0 |
| 0.9020833333333332 | 0 |
| 0.9027777777777778 | 0 |
| 0.9034722222222222 | 0 |
| 0.9041666666666667 | 0 |
| 0.904861111111111 | 0 |
| 0.9055555555555556 | 0 |
| 0.90625 | 0 |
| 0.9069444444444444 | 0 |
| 0.907638888888889 | 0 |
| 0.9083333333333333 | 0 |
| 0.9090277777777778 | 0 |
| 0.9097222222222222 | 0 |
| 0.9104166666666668 | 0 |
| 0.9111111111111111 | 0 |
| 0.9118055555555555 | 0 |
| 0.9125 | 0 |
| 0.9131944444444445 | 0 |
| 0.9138888888888889 | 0 |
| 0.9145833333333333 | 0 |
| 0.9152777777777777 | 0 |
| 0.9159722222222223 | 0 |
| 0.9166666666666666 | 0 |
| 0.9173611111111111 | 0 |
| 0.9180555555555556 | 0 |
| 0.9187500000000001 | 0 |
| 0.9194444444444444 | 0 |
| 0.9201388888888888 | 0 |
| 0.9208333333333334 | 0 |
| 0.9215277777777778 | 0 |
| 0.9222222222222222 | 0 |
| 0.9229166666666666 | 0 |
| 0.9236111111111112 | 0 |
| 0.9243055555555556 | 0 |
| 0.9249999999999999 | 0 |
| 0.9256944444444444 | 0 |
| 0.9263888888888889 | 0 |
| 0.9270833333333334 | 0 |
| 0.9277777777777777 | 0 |
| 0.9284722222222223 | 0 |
| 0.9291666666666667 | 0 |
| 0.9298611111111111 | 0 |
| 0.9305555555555555 | 0 |
| 0.93125 | 0 |
| 0.9319444444444445 | 0 |
| 0.9326388888888889 | 0 |
| 0.9333333333333332 | 0 |
| 0.9340277777777778 | 0 |
| 0.9347222222222222 | 0 |
| 0.9354166666666667 | 0 |
| 0.936111111111111 | 0 |
| 0.9368055555555556 | 0 |
| 0.9375 | 0 |
| 0.9381944444444444 | 0 |
| 0.938888888888889 | 0 |
| 0.9395833333333333 | 0 |
| 0.9402777777777778 | 0 |
| 0.9409722222222222 | 0 |
| 0.9416666666666668 | 0 |
| 0.9423611111111111 | 0 |
| 0.9430555555555555 | 0 |
| 0.94375 | 0 |
| 0.9444444444444445 | 0 |
| 0.9451388888888889 | 0 |
| 0.9458333333333333 | 0 |
| 0.9465277777777777 | 0 |
| 0.9472222222222223 | 0 |
| 0.9479166666666666 | 0 |
| 0.9486111111111111 | 0 |
| 0.9493055555555556 | 0 |
| 0.9500000000000001 | 0 |
| 0.9506944444444444 | 0 |
| 0.9513888888888888 | 0 |
| 0.9520833333333334 | 0 |
| 0.9527777777777778 | 0 |
| 0.9534722222222222 | 0 |
| 0.9541666666666666 | 0 |
| 0.9548611111111112 | 0 |
| 0.9555555555555556 | 0 |
| 0.9562499999999999 | 0 |
| 0.9569444444444444 | 0 |
| 0.9576388888888889 | 0 |
| 0.9583333333333334 | 0 |
| 0.9590277777777777 | 0 |
| 0.9597222222222223 | 0 |
| 0.9604166666666667 | 0 |
| 0.9611111111111111 | 0 |
| 0.9618055555555555 | 0 |
| 0.9625 | 0 |
| 0.9631944444444445 | 0 |
| 0.9638888888888889 | 0 |
| 0.9645833333333332 | 0 |
| 0.9652777777777778 | 0 |
| 0.9659722222222222 | 0 |
| 0.9666666666666667 | 0 |
| 0.967361111111111 | 0 |
| 0.9680555555555556 | 0 |
| 0.96875 | 0 |
| 0.9694444444444444 | 0 |
| 0.970138888888889 | 0 |
| 0.9708333333333333 | 0 |
| 0.9715277777777778 | 0 |
| 0.9722222222222222 | 0 |
| 0.9729166666666668 | 0 |
| 0.9736111111111111 | 0 |
| 0.9743055555555555 | 0 |
| 0.975 | 0 |
| 0.9756944444444445 | 0 |
| 0.9763888888888889 | 0 |
| 0.9770833333333333 | 0 |
| 0.9777777777777777 | 0 |
| 0.9784722222222223 | 0 |
| 0.9791666666666666 | 0 |
| 0.9798611111111111 | 0 |
| 0.9805555555555556 | 0 |
| 0.9812500000000001 | 0 |
| 0.9819444444444444 | 0 |
| 0.9826388888888888 | 0 |
| 0.9833333333333334 | 0 |
| 0.9840277777777778 | 0 |
| 0.9847222222222222 | 0 |
| 0.9854166666666666 | 0 |
| 0.9861111111111112 | 0 |
| 0.9868055555555556 | 0 |
| 0.9874999999999999 | 0 |
| 0.9881944444444444 | 0 |
| 0.9888888888888889 | 0 |
| 0.9895833333333334 | 0 |
| 0.9902777777777777 | 0 |
| 0.9909722222222223 | 0 |
| 0.9916666666666667 | 0 |
| 0.9923611111111111 | 0 |
| 0.9930555555555555 | 0 |
| 0.99375 | 0 |
| 0.9944444444444445 | 0 |
| 0.9951388888888889 | 0 |
| 0.9958333333333332 | 0 |
| 0.9965277777777778 | 0 |
| 0.9972222222222222 | 0 |
| 0.9979166666666667 | 0 |
| 0.998611111111111 | 0 |
| 0.9993055555555556 | 0 |